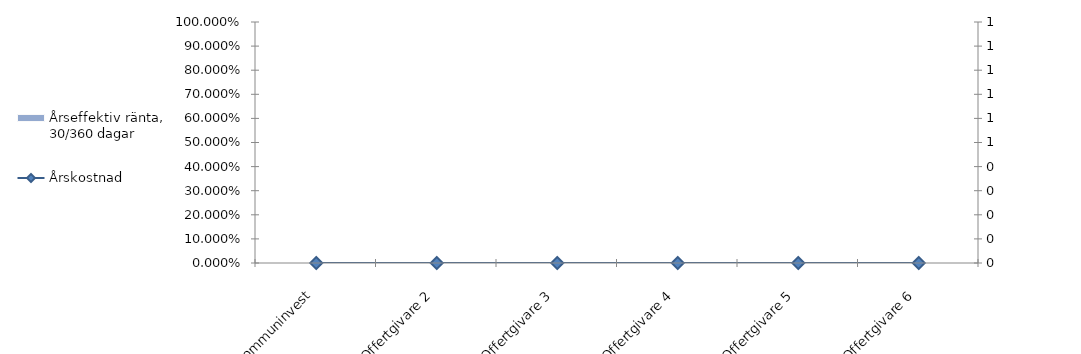
| Category | Årseffektiv ränta, 30/360 dagar |
|---|---|
| Kommuninvest | 0 |
| Offertgivare 2 | 0 |
| Offertgivare 3 | 0 |
| Offertgivare 4 | 0 |
| Offertgivare 5 | 0 |
| Offertgivare 6 | 0 |